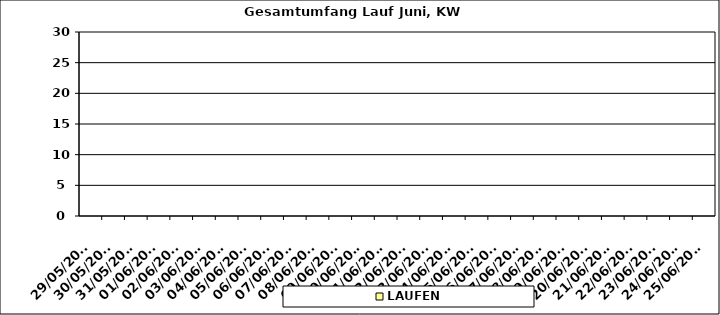
| Category | LAUFEN |
|---|---|
| 29/05/2023 | 0 |
| 30/05/2023 | 0 |
| 31/05/2023 | 0 |
| 01/06/2023 | 0 |
| 02/06/2023 | 0 |
| 03/06/2023 | 0 |
| 04/06/2023 | 0 |
| 05/06/2023 | 0 |
| 06/06/2023 | 0 |
| 07/06/2023 | 0 |
| 08/06/2023 | 0 |
| 09/06/2023 | 0 |
| 10/06/2023 | 0 |
| 11/06/2023 | 0 |
| 12/06/2023 | 0 |
| 13/06/2023 | 0 |
| 14/06/2023 | 0 |
| 15/06/2023 | 0 |
| 16/06/2023 | 0 |
| 17/06/2023 | 0 |
| 18/06/2023 | 0 |
| 19/06/2023 | 0 |
| 20/06/2023 | 0 |
| 21/06/2023 | 0 |
| 22/06/2023 | 0 |
| 23/06/2023 | 0 |
| 24/06/2023 | 0 |
| 25/06/2023 | 0 |